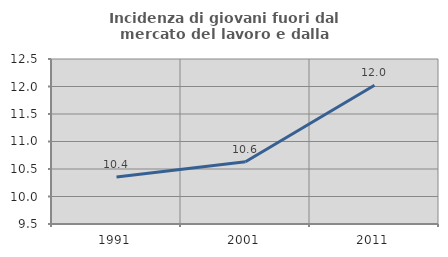
| Category | Incidenza di giovani fuori dal mercato del lavoro e dalla formazione  |
|---|---|
| 1991.0 | 10.354 |
| 2001.0 | 10.631 |
| 2011.0 | 12.023 |